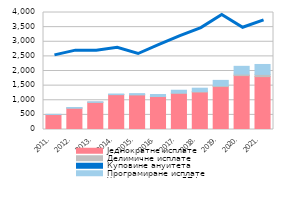
| Category | Једнократне исплате | Делимичне исплате | Куповине ануитета | Програмиране исплате |
|---|---|---|---|---|
| 2011. | 511.736 | 4.179 | 0 | 1.631 |
| 2012. | 732.82 | 0.095 | 0 | 18.744 |
| 2013. | 930.814 | 0.362 | 0 | 14.024 |
| 2014. | 1193.016 | 1.001 | 0 | 19.359 |
| 2015. | 1186.061 | 2.555 | 0 | 37.557 |
| 2016. | 1126.417 | 4.433 | 0 | 64.785 |
| 2017. | 1237.64 | 11.65 | 0 | 93.12 |
| 2018. | 1278.16 | 21.43 | 0 | 112.35 |
| 2019. | 1468.28 | 31.41 | 0 | 180.14 |
| 2020. | 1842.9 | 50.26 | 0 | 266.48 |
| 2021. | 1807.78 | 75.33 | 0 | 340.4 |